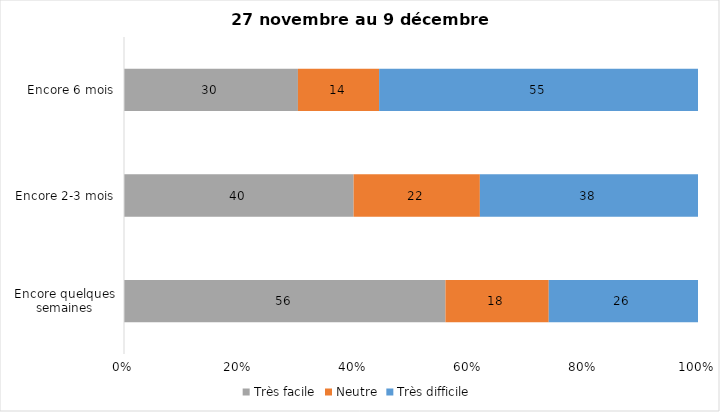
| Category | Très facile | Neutre | Très difficile |
|---|---|---|---|
| Encore quelques semaines | 56 | 18 | 26 |
| Encore 2-3 mois | 40 | 22 | 38 |
| Encore 6 mois | 30 | 14 | 55 |